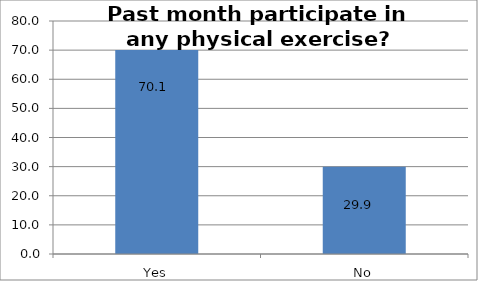
| Category | Series 0 |
|---|---|
| Yes | 70.072 |
| No | 29.928 |